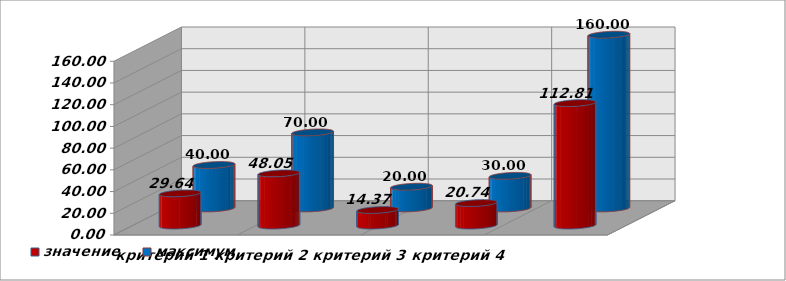
| Category | значение | максимум |
|---|---|---|
| критерий 1 | 29.643 | 40 |
| критерий 2 | 48.052 | 70 |
| критерий 3 | 14.366 | 20 |
| критерий 4 | 20.744 | 30 |